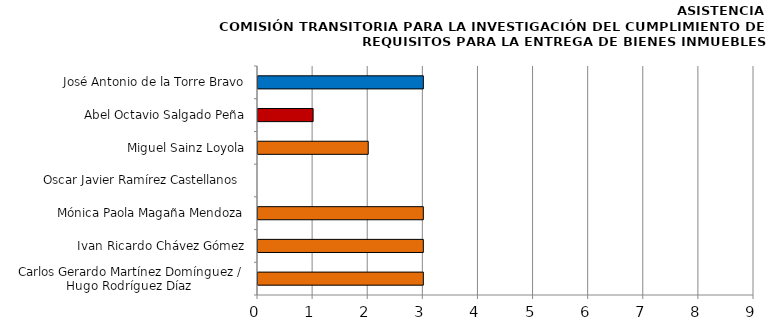
| Category | Series 0 |
|---|---|
| Carlos Gerardo Martínez Domínguez /
Hugo Rodríguez Díaz  | 3 |
| Ivan Ricardo Chávez Gómez | 3 |
| Mónica Paola Magaña Mendoza | 3 |
| Oscar Javier Ramírez Castellanos  | 0 |
| Miguel Sainz Loyola | 2 |
| Abel Octavio Salgado Peña | 1 |
| José Antonio de la Torre Bravo | 3 |